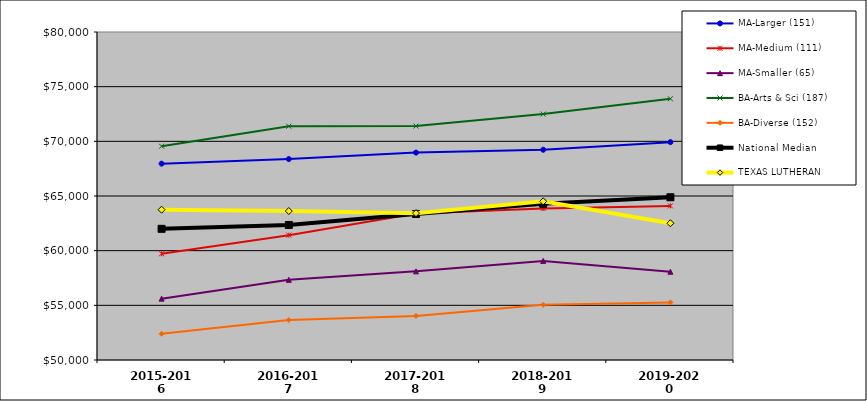
| Category | MA-Larger (151) | MA-Medium (111) | MA-Smaller (65) | BA-Arts & Sci (187) | BA-Diverse (152) | National Median | TEXAS LUTHERAN |
|---|---|---|---|---|---|---|---|
| 2015-2016 | 67959 | 59715 | 55611 | 69552 | 52393.5 | 61996.5 | 63747 |
| 2016-2017 | 68378 | 61420 | 57330 | 71382 | 53654.5 | 62349 | 63624 |
| 2017-2018 | 68968 | 63397 | 58107 | 71395 | 54031.5 | 63357 | 63432 |
| 2018-2019 | 69230 | 63854 | 59064 | 72493 | 55043 | 64282.5 | 64514 |
| 2019-2020 | 69927 | 64096 | 58069 | 73894 | 55266.5 | 64884.5 | 62508 |